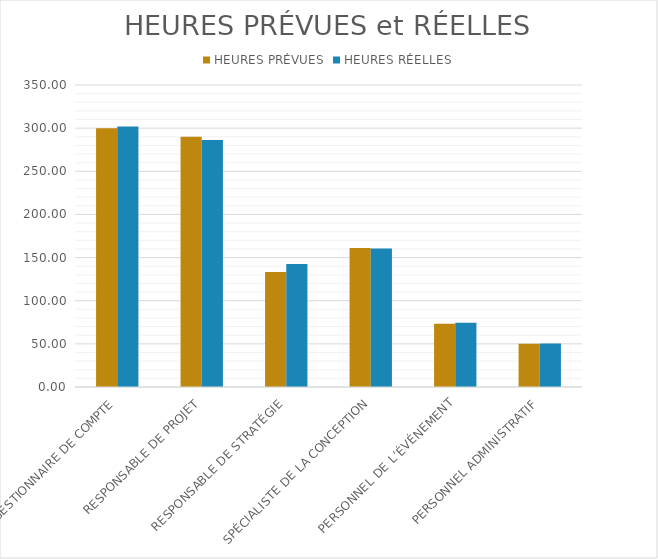
| Category | HEURES PRÉVUES | HEURES RÉELLES |
|---|---|---|
| GESTIONNAIRE DE COMPTE | 300 | 302 |
| RESPONSABLE DE PROJET | 290 | 286.333 |
| RESPONSABLE DE STRATÉGIE | 133.333 | 142.5 |
| SPÉCIALISTE DE LA CONCEPTION | 161.111 | 160.556 |
| PERSONNEL DE L’ÉVÉNEMENT | 73.333 | 74.444 |
| PERSONNEL ADMINISTRATIF | 50 | 50.333 |